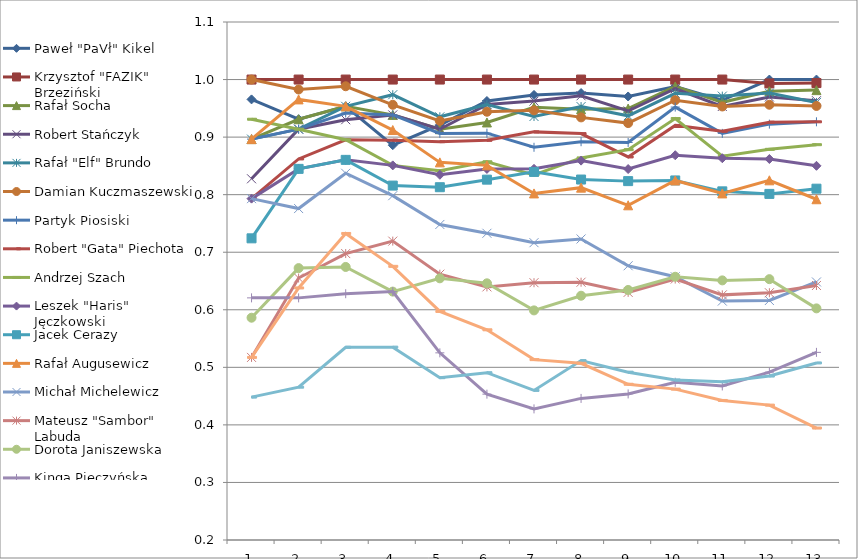
| Category | Paweł "PaVł" Kikel | Krzysztof "FAZIK" Brzeziński | Rafał Socha | Robert Stańczyk | Rafał "Elf" Brundo | Damian Kuczmaszewski | Partyk Piosiski | Robert "Gata" Piechota | Andrzej Szach | Leszek "Haris" Jęczkowski | Jacek Cerazy | Rafał Augusewicz | Michał Michelewicz | Mateusz "Sambor" Labuda | Dorota Janiszewska | Kinga Pieczyńska | Dominika Kędzierska | Michał "Michał7" Danes |
|---|---|---|---|---|---|---|---|---|---|---|---|---|---|---|---|---|---|---|
| 0 | 0.966 | 1 | 0.897 | 0.828 | 0.897 | 1 | 0.897 | 0.793 | 0.931 | 0.793 | 0.724 | 0.897 | 0.793 | 0.517 | 0.586 | 0.621 | 0.448 | 0.517 |
| 1 | 0.931 | 1 | 0.931 | 0.914 | 0.914 | 0.983 | 0.914 | 0.862 | 0.914 | 0.845 | 0.845 | 0.966 | 0.776 | 0.655 | 0.672 | 0.621 | 0.466 | 0.638 |
| 2 | 0.953 | 1 | 0.953 | 0.93 | 0.953 | 0.988 | 0.942 | 0.895 | 0.895 | 0.86 | 0.86 | 0.953 | 0.837 | 0.698 | 0.674 | 0.628 | 0.535 | 0.733 |
| 3 | 0.886 | 1 | 0.939 | 0.939 | 0.974 | 0.956 | 0.939 | 0.895 | 0.851 | 0.851 | 0.816 | 0.912 | 0.798 | 0.719 | 0.632 | 0.632 | 0.535 | 0.675 |
| 4 | 0.921 | 1 | 0.914 | 0.914 | 0.935 | 0.928 | 0.906 | 0.892 | 0.842 | 0.835 | 0.813 | 0.856 | 0.748 | 0.662 | 0.655 | 0.525 | 0.482 | 0.597 |
| 5 | 0.963 | 1 | 0.925 | 0.957 | 0.957 | 0.944 | 0.907 | 0.894 | 0.857 | 0.845 | 0.826 | 0.851 | 0.733 | 0.64 | 0.646 | 0.453 | 0.491 | 0.565 |
| 6 | 0.973 | 1 | 0.952 | 0.963 | 0.936 | 0.947 | 0.882 | 0.909 | 0.834 | 0.845 | 0.84 | 0.802 | 0.717 | 0.647 | 0.599 | 0.428 | 0.46 | 0.513 |
| 7 | 0.977 | 1 | 0.948 | 0.972 | 0.953 | 0.934 | 0.892 | 0.906 | 0.864 | 0.859 | 0.826 | 0.812 | 0.723 | 0.648 | 0.624 | 0.446 | 0.512 | 0.507 |
| 8 | 0.971 | 1 | 0.95 | 0.945 | 0.937 | 0.924 | 0.891 | 0.866 | 0.878 | 0.845 | 0.824 | 0.782 | 0.676 | 0.63 | 0.634 | 0.454 | 0.492 | 0.471 |
| 9 | 0.988 | 1 | 0.988 | 0.984 | 0.976 | 0.964 | 0.952 | 0.92 | 0.932 | 0.869 | 0.825 | 0.825 | 0.657 | 0.653 | 0.657 | 0.474 | 0.478 | 0.462 |
| 10 | 0.964 | 1 | 0.96 | 0.953 | 0.971 | 0.953 | 0.906 | 0.91 | 0.867 | 0.863 | 0.806 | 0.802 | 0.615 | 0.626 | 0.651 | 0.468 | 0.475 | 0.442 |
| 11 | 1 | 0.993 | 0.98 | 0.97 | 0.976 | 0.956 | 0.923 | 0.926 | 0.879 | 0.862 | 0.801 | 0.825 | 0.616 | 0.63 | 0.653 | 0.492 | 0.485 | 0.434 |
| 12 | 1 | 0.994 | 0.982 | 0.963 | 0.96 | 0.954 | 0.927 | 0.927 | 0.887 | 0.85 | 0.81 | 0.792 | 0.648 | 0.642 | 0.602 | 0.526 | 0.508 | 0.394 |